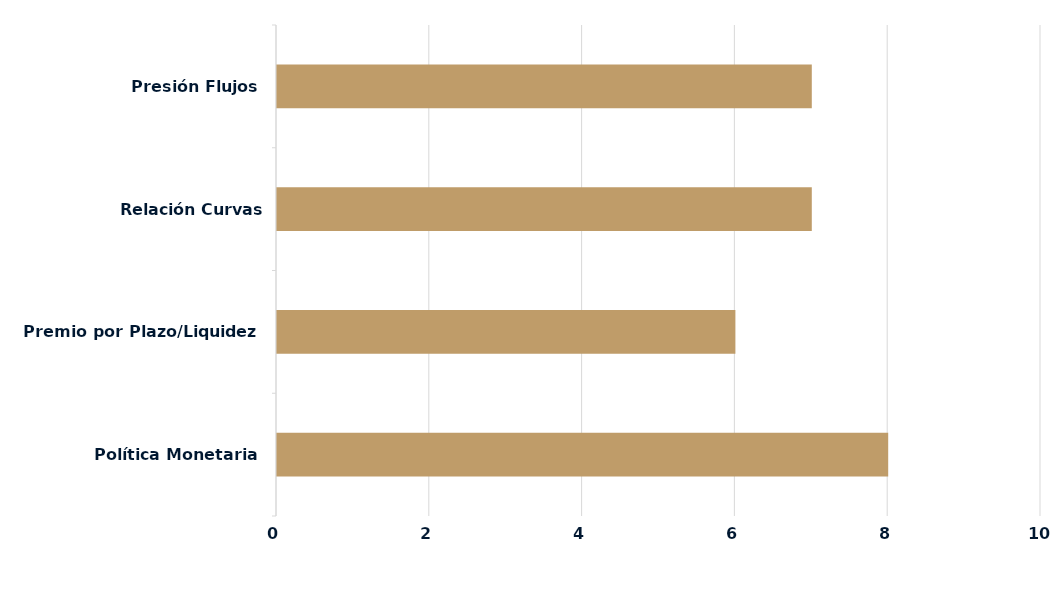
| Category | Series 0 |
|---|---|
| Política Monetaria | 8 |
| Premio por Plazo/Liquidez | 6 |
| Relación Curvas Internacionales | 7 |
| Presión Flujos | 7 |